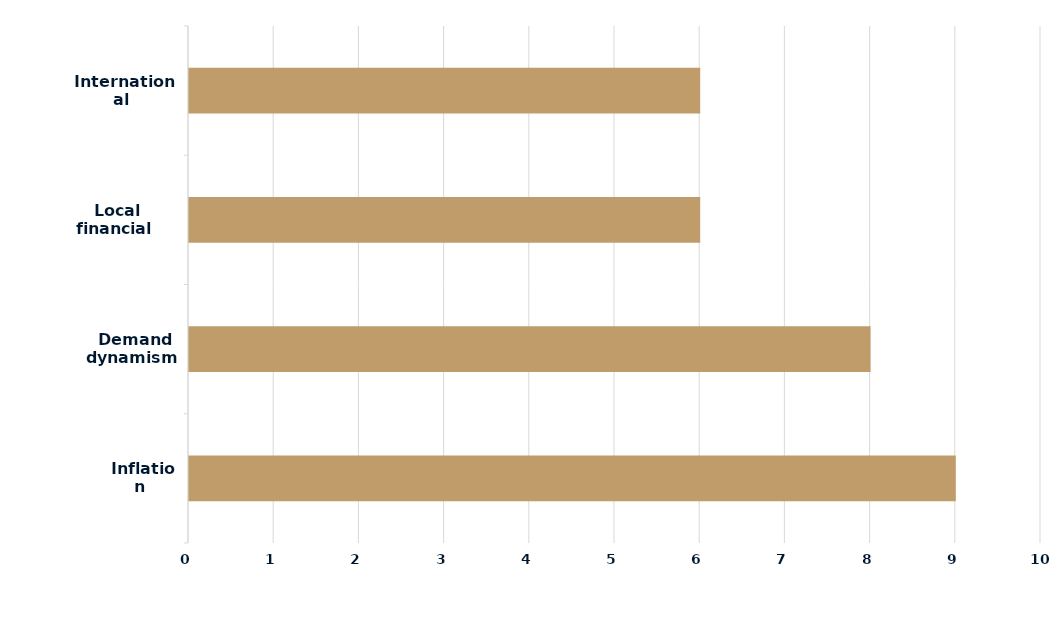
| Category | Series 0 |
|---|---|
|  Inflation | 9 |
|  Demand dynamism | 8 |
|  Local financial conditions | 6 |
|  International environment | 6 |